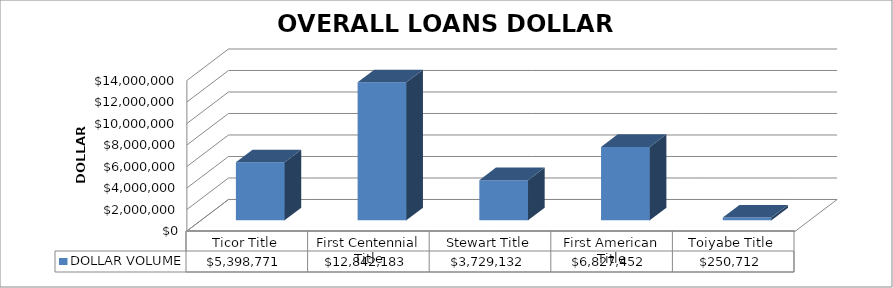
| Category | DOLLAR VOLUME |
|---|---|
| Ticor Title | 5398771 |
| First Centennial Title | 12842183 |
| Stewart Title | 3729132 |
| First American Title | 6827452 |
| Toiyabe Title | 250712 |